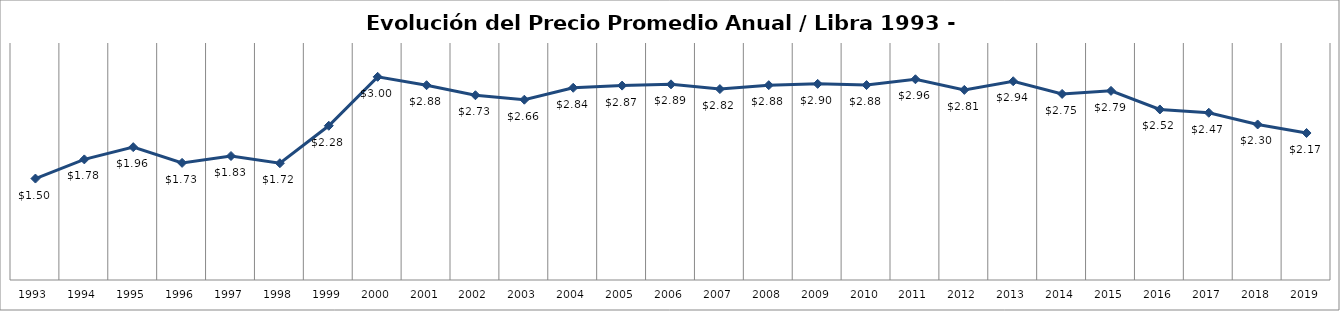
| Category | Series 0 |
|---|---|
| 1993.0 | 1.498 |
| 1994.0 | 1.781 |
| 1995.0 | 1.962 |
| 1996.0 | 1.73 |
| 1997.0 | 1.831 |
| 1998.0 | 1.725 |
| 1999.0 | 2.278 |
| 2000.0 | 3 |
| 2001.0 | 2.877 |
| 2002.0 | 2.728 |
| 2003.0 | 2.662 |
| 2004.0 | 2.839 |
| 2005.0 | 2.871 |
| 2006.0 | 2.889 |
| 2007.0 | 2.819 |
| 2008.0 | 2.877 |
| 2009.0 | 2.896 |
| 2010.0 | 2.879 |
| 2011.0 | 2.965 |
| 2012.0 | 2.807 |
| 2013.0 | 2.935 |
| 2014.0 | 2.748 |
| 2015.0 | 2.793 |
| 2016.0 | 2.519 |
| 2017.0 | 2.47 |
| 2018.0 | 2.297 |
| 2019.0 | 2.171 |